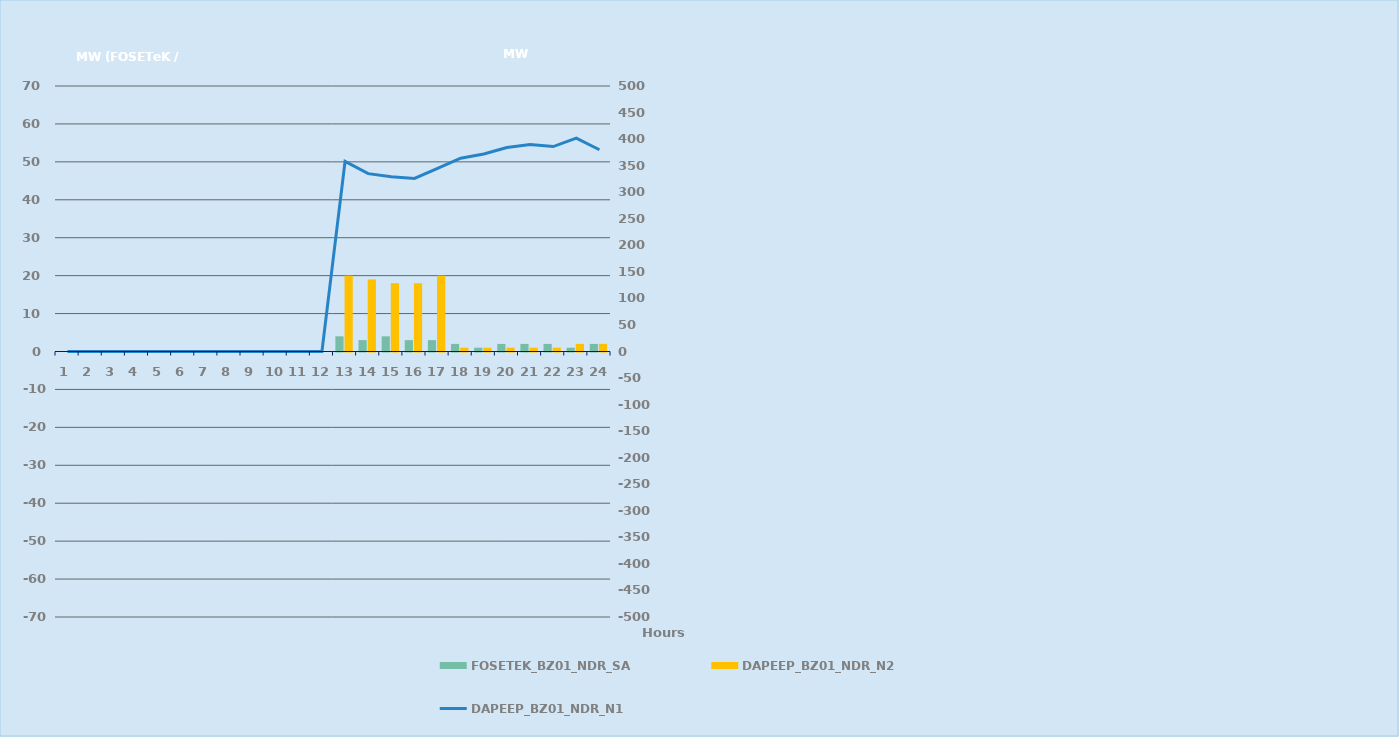
| Category | FOSETEK_BZ01_NDR_SA | DAPEEP_BZ01_NDR_N2 |
|---|---|---|
| 0 | 0 | 0 |
| 1 | 0 | 0 |
| 2 | 0 | 0 |
| 3 | 0 | 0 |
| 4 | 0 | 0 |
| 5 | 0 | 0 |
| 6 | 0 | 0 |
| 7 | 0 | 0 |
| 8 | 0 | 0 |
| 9 | 0 | 0 |
| 10 | 0 | 0 |
| 11 | 0 | 0 |
| 12 | 4 | 20 |
| 13 | 3 | 19 |
| 14 | 4 | 18 |
| 15 | 3 | 18 |
| 16 | 3 | 20 |
| 17 | 2 | 1 |
| 18 | 1 | 1 |
| 19 | 2 | 1 |
| 20 | 2 | 1 |
| 21 | 2 | 1 |
| 22 | 1 | 2 |
| 23 | 2 | 2 |